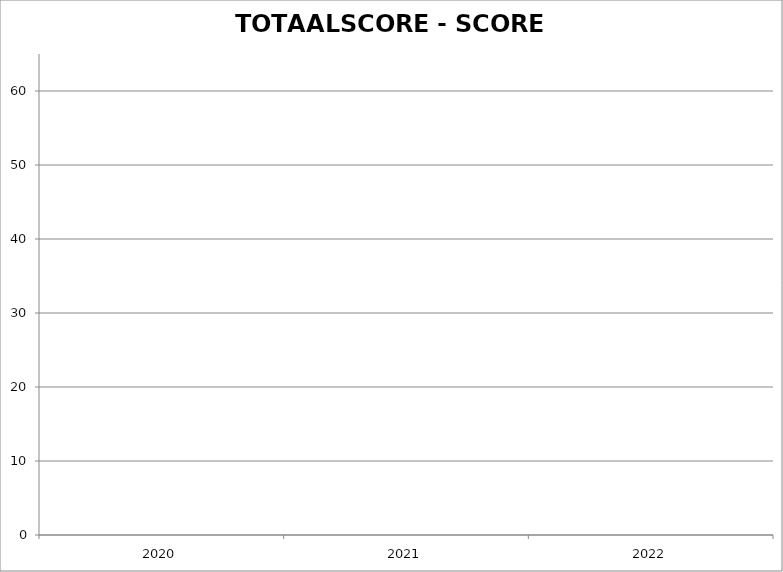
| Category | TOTAALSCORE |
|---|---|
| 2020.0 | 0 |
| 2021.0 | 0 |
| 2022.0 | 0 |